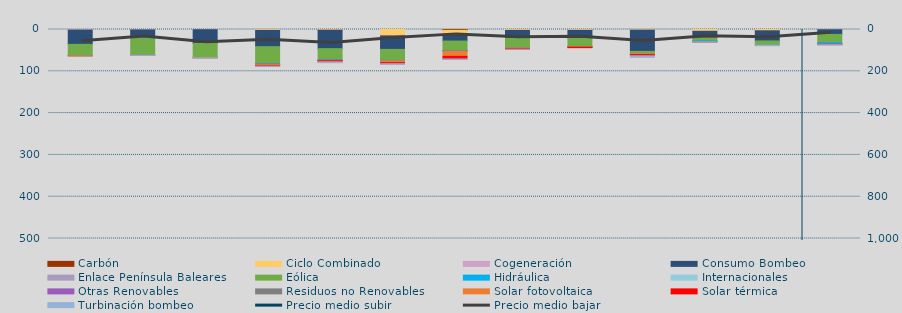
| Category | Carbón | Ciclo Combinado | Cogeneración | Consumo Bombeo | Enlace Península Baleares | Eólica | Hidráulica | Internacionales | Otras Renovables | Residuos no Renovables | Solar fotovoltaica | Solar térmica | Turbinación bombeo |
|---|---|---|---|---|---|---|---|---|---|---|---|---|---|
| 0 | 0 | 754.5 | 626.3 | 34195.3 | 0 | 26304.6 | 431 | 0 | 574.8 | 3.9 | 78.7 | 0 | 0 |
| 1 | 0 | 527.6 | 537.7 | 17096.8 | 0 | 43158.6 | 57.1 | 0 | 178.1 | 0 | 29.6 | 0 | 157.5 |
| 2 | 0 | 33.9 | 492.3 | 32860 | 204 | 33430.9 | 70.8 | 0 | 339.4 | 109.7 | 324.3 | 0 | 570.1 |
| 3 | 0 | 1823.5 | 445.3 | 38830 | 0 | 40976.3 | 479.9 | 0 | 886 | 0.2 | 2434.6 | 1489.3 | 549.6 |
| 4 | 543 | 1288.6 | 238.655 | 43678.268 | 0 | 27098.515 | 150.455 | 0 | 982.208 | 13.2 | 761.432 | 2474.8 | 2164.5 |
| 5 | 0 | 14634.199 | 838.098 | 32075.867 | 0 | 26340.743 | 533.073 | 0 | 507.085 | 0 | 4421.722 | 2509.099 | 1924.625 |
| 6 | 1932.082 | 9683.392 | 448.406 | 15579.715 | 0 | 23351.965 | 345.088 | 0 | 633.184 | 108.783 | 12157.29 | 6064.342 | 913.05 |
| 7 | 0 | 2088.417 | 56.138 | 18984.933 | 0 | 23010.334 | 40.779 | 0 | 39.002 | 82.474 | 1741.959 | 1100.186 | 17.7 |
| 8 | 20 | 1489.042 | 599.786 | 18456.273 | 0 | 20881.86 | 87.748 | 0 | 304.724 | 12.55 | 573.462 | 1034.589 | 0 |
| 9 | 0 | 1431.5 | 183.958 | 50768.847 | 0 | 5100.208 | 273.474 | 0 | 90.045 | 0 | 2259.405 | 2752.042 | 3910.508 |
| 10 | 0 | 4345.9 | 27.314 | 15616.296 | 0 | 6806.453 | 2149.971 | 0 | 152.334 | 42.654 | 44.067 | 19 | 204.333 |
| 11 | 0 | 3059.067 | 0 | 24243.492 | 0 | 10425.232 | 13.796 | 0 | 0 | 0 | 9.194 | 0 | 1113.3 |
| 12 | 0 | 0 | 655.675 | 11045.084 | 0 | 19430.531 | 3297.137 | 0 | 1221.2 | 4.575 | 380.934 | 279.19 | 100 |